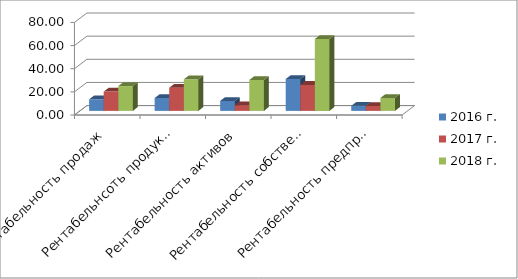
| Category | 2016 г. | 2017 г. | 2018 г. |
|---|---|---|---|
| Рентабельность продаж | 10 | 16.667 | 21.429 |
| Рентабельнсоть продукции (затрат) | 11.111 | 20 | 27.273 |
| Рентабельность активов | 8.615 | 4.878 | 26.714 |
| Рентабельность собственного капитала | 27.564 | 22.46 | 62.121 |
| Рентабельность предпрятия  | 4.357 | 4.208 | 11.162 |